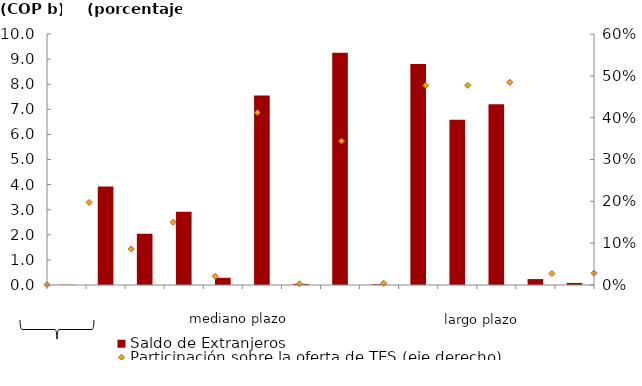
| Category | Saldo de Extranjeros |
|---|---|
| 1.0 | 0.012 |
| 2.0 | 3.92 |
| 3.0 | 2.037 |
| 4.0 | 2.916 |
| 5.0 | 0.288 |
| 6.0 | 7.554 |
| 7.0 | 0.042 |
| 8.0 | 9.255 |
| 9.0 | 0.026 |
| 10.0 | 8.801 |
| 12.0 | 6.58 |
| 14.0 | 7.2 |
| 17.0 | 0.236 |
| 19.0 | 0.081 |